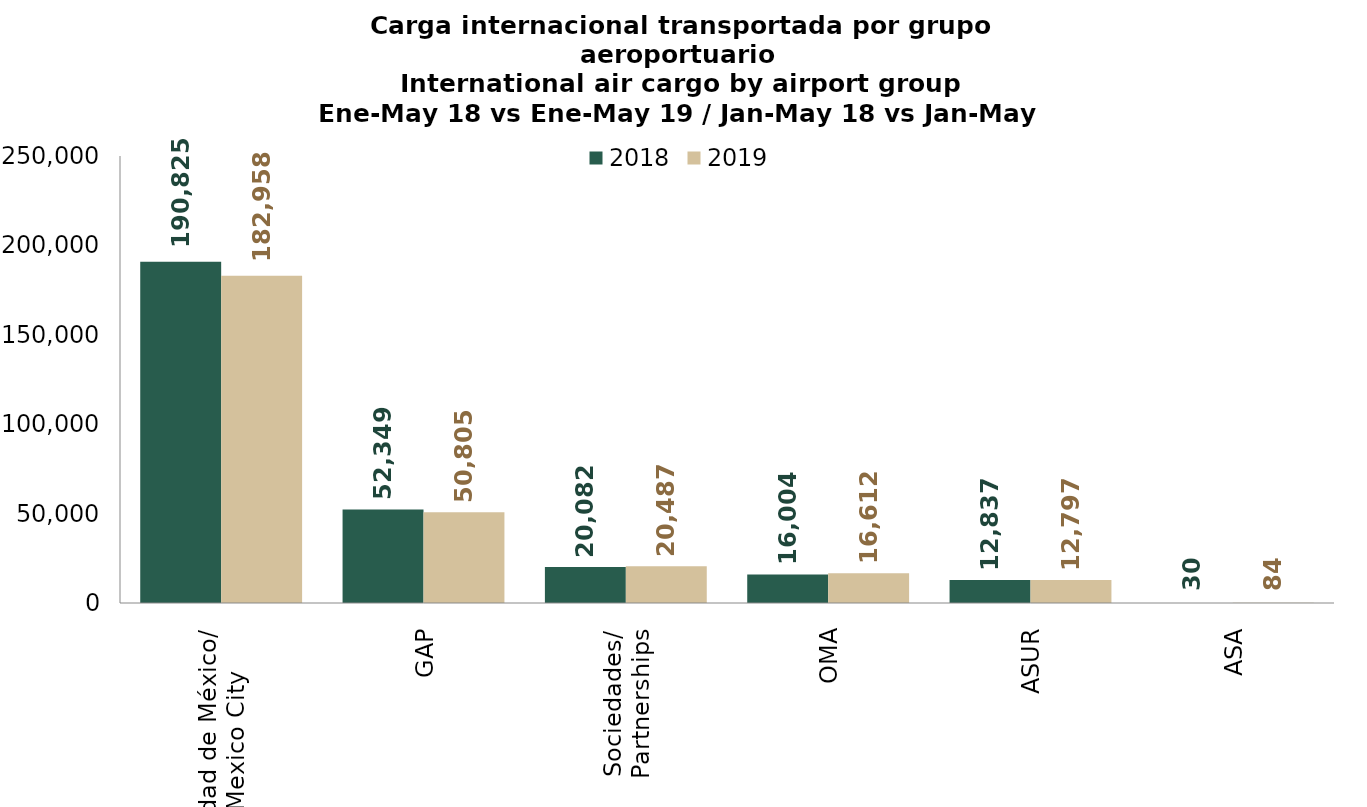
| Category | 2018 | 2019 |
|---|---|---|
| Ciudad de México/
Mexico City | 190824.58 | 182957.6 |
| GAP | 52349.293 | 50805.094 |
| Sociedades/
Partnerships | 20082.096 | 20486.528 |
| OMA | 16004.021 | 16611.736 |
| ASUR | 12836.52 | 12797.184 |
| ASA | 29.832 | 84.414 |